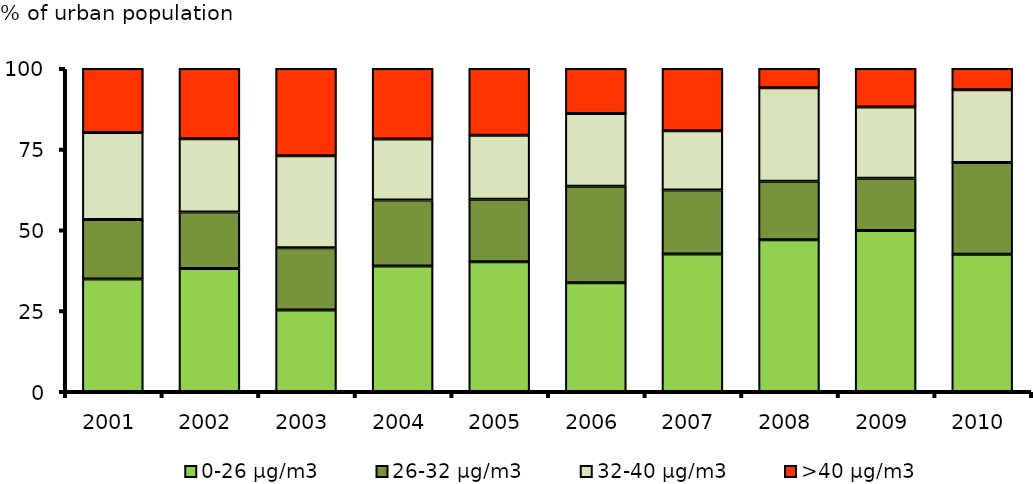
| Category | 0-26 μg/m3 | 26-32 μg/m3 | 32-40 μg/m3 | >40 μg/m3 |
|---|---|---|---|---|
| 2001.0 | 34.864 | 18.364 | 26.989 | 19.783 |
| 2002.0 | 38.102 | 17.498 | 22.683 | 21.717 |
| 2003.0 | 25.222 | 19.25 | 28.545 | 26.983 |
| 2004.0 | 38.821 | 20.486 | 18.84 | 21.854 |
| 2005.0 | 40.16 | 19.392 | 19.758 | 20.69 |
| 2006.0 | 33.682 | 29.868 | 22.511 | 13.94 |
| 2007.0 | 42.606 | 19.805 | 18.308 | 19.281 |
| 2008.0 | 46.967 | 18.108 | 28.991 | 5.935 |
| 2009.0 | 49.869 | 16.12 | 22.071 | 11.94 |
| 2010.0 | 42.459 | 28.423 | 22.53 | 6.588 |